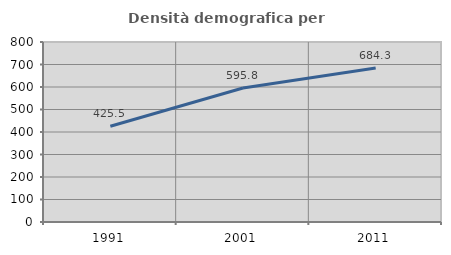
| Category | Densità demografica |
|---|---|
| 1991.0 | 425.544 |
| 2001.0 | 595.762 |
| 2011.0 | 684.345 |